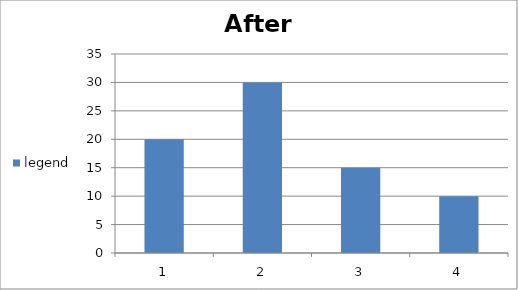
| Category | legend |
|---|---|
| 0 | 20 |
| 1 | 30 |
| 2 | 15 |
| 3 | 10 |